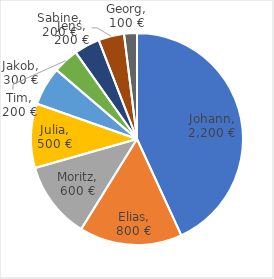
| Category | Umsatz Mai 2020 |
|---|---|
| Johann | 2200 |
| Elias | 800 |
| Moritz | 600 |
| Julia | 500 |
| Jakob | 300 |
| Tim | 200 |
| Sabine | 200 |
| Jens | 200 |
| Georg | 100 |